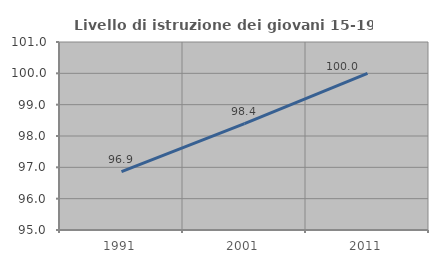
| Category | Livello di istruzione dei giovani 15-19 anni |
|---|---|
| 1991.0 | 96.861 |
| 2001.0 | 98.396 |
| 2011.0 | 100 |